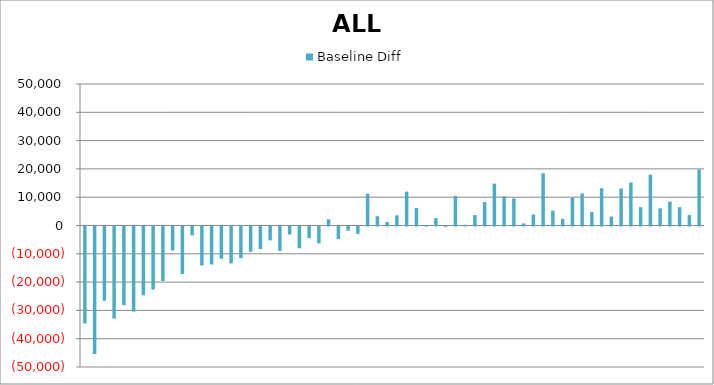
| Category | Baseline Diff |
|---|---|
| 0 | -34279.43 |
| 1 | -45085.622 |
| 2 | -26242.233 |
| 3 | -32530.345 |
| 4 | -27813.361 |
| 5 | -30086.601 |
| 6 | -24301.225 |
| 7 | -22300.77 |
| 8 | -19248.887 |
| 9 | -8464.836 |
| 10 | -16797.803 |
| 11 | -3143.084 |
| 12 | -13749.771 |
| 13 | -13425.367 |
| 14 | -11389.295 |
| 15 | -13039.716 |
| 16 | -11208.682 |
| 17 | -8952.049 |
| 18 | -7959.101 |
| 19 | -4900.72 |
| 20 | -8609.114 |
| 21 | -2814.952 |
| 22 | -7691.131 |
| 23 | -4104.75 |
| 24 | -5955.879 |
| 25 | 2178.064 |
| 26 | -4461.524 |
| 27 | -1484.606 |
| 28 | -2594.031 |
| 29 | 11221.447 |
| 30 | 3267.033 |
| 31 | 1240.346 |
| 32 | 3593.844 |
| 33 | 11967.602 |
| 34 | 6166.701 |
| 35 | 101.8 |
| 36 | 2591.75 |
| 37 | -136.45 |
| 38 | 10456.64 |
| 39 | 244.268 |
| 40 | 3689.023 |
| 41 | 8303.006 |
| 42 | 14786.528 |
| 43 | 10333.904 |
| 44 | 9563.804 |
| 45 | 737.612 |
| 46 | 3901.04 |
| 47 | 18460.146 |
| 48 | 5238.728 |
| 49 | 2336.292 |
| 50 | 9726.487 |
| 51 | 11318.91 |
| 52 | 4825.039 |
| 53 | 13171.362 |
| 54 | 3152.839 |
| 55 | 13068 |
| 56 | 15180 |
| 57 | 6468 |
| 58 | 17952 |
| 59 | 6072 |
| 60 | 8448 |
| 61 | 6468 |
| 62 | 3696 |
| 63 | 19800 |